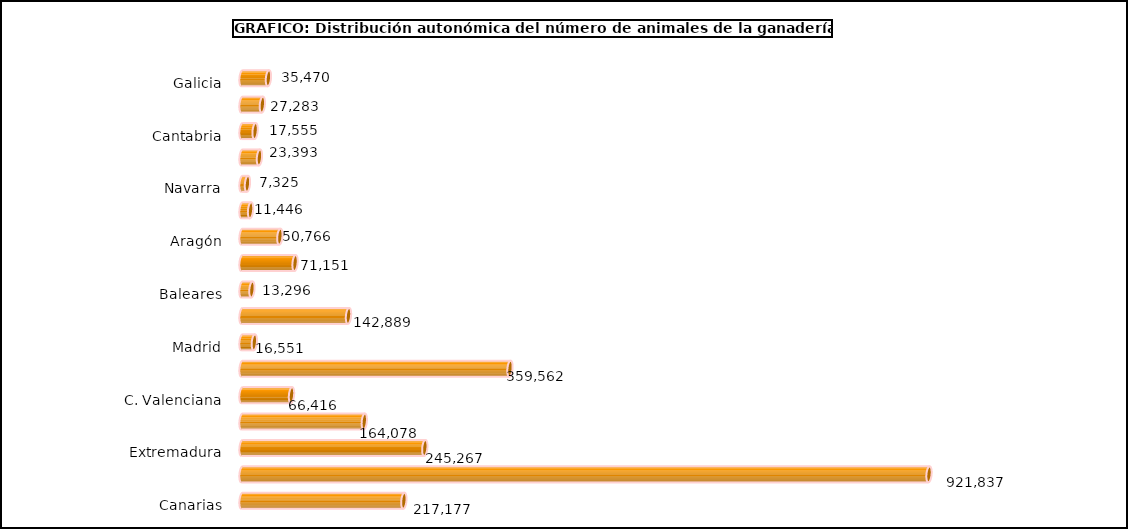
| Category | num. Animales |
|---|---|
|   Galicia | 35470 |
|   P. de Asturias | 27283 |
|   Cantabria | 17555 |
|   País Vasco | 23393 |
|   Navarra | 7325 |
|   La Rioja | 11446 |
|   Aragón | 50766 |
|   Cataluña | 71151 |
|   Baleares | 13296 |
|   Castilla y León | 142889 |
|   Madrid | 16551 |
|   Castilla – La Mancha | 359562 |
|   C. Valenciana | 66416 |
|   R. de Murcia | 164078 |
|   Extremadura | 245267 |
|   Andalucía | 921837 |
|   Canarias | 217177 |